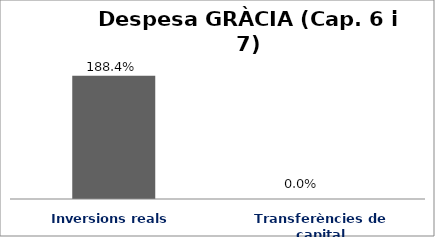
| Category | Series 0 |
|---|---|
| Inversions reals | 1.884 |
| Transferències de capital | 0 |